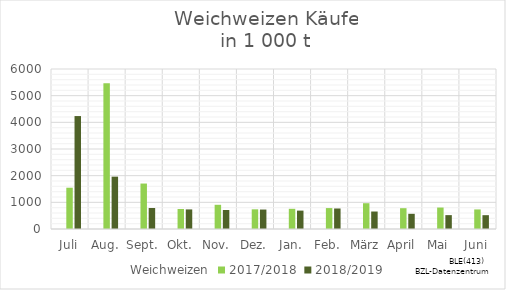
| Category | Weichweizen | 2017/2018 | 2018/2019 |
|---|---|---|---|
| Juli |  | 1548.017 | 4235.258 |
| Aug. |  | 5464.637 | 1962.934 |
| Sept. |  | 1704.63 | 787.337 |
| Okt. |  | 749.976 | 734.335 |
| Nov. |  | 907.595 | 713.353 |
| Dez. |  | 738.091 | 729.505 |
| Jan. |  | 756.999 | 689.616 |
| Feb. |  | 784.359 | 769.231 |
| März |  | 966.849 | 655.691 |
| April |  | 780.17 | 569.658 |
| Mai |  | 804.805 | 520.35 |
| Juni |  | 733.669 | 518.459 |